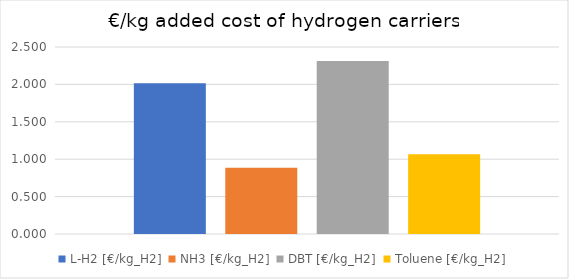
| Category | L-H2 [€/kg_H2] | NH3 [€/kg_H2] | DBT [€/kg_H2] | Toluene [€/kg_H2] |
|---|---|---|---|---|
| 0 | 2.014 | 0.886 | 2.313 | 1.066 |